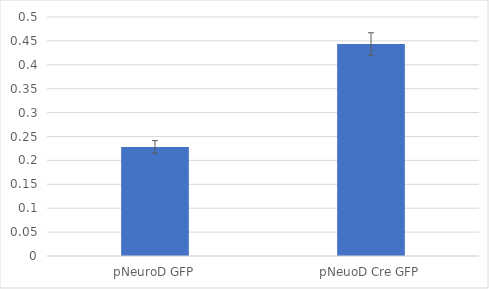
| Category | Series 0 |
|---|---|
| pNeuroD GFP | 0.228 |
| pNeuoD Cre GFP | 0.443 |